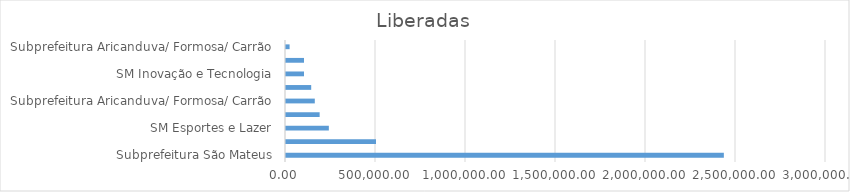
| Category | Series 0 |
|---|---|
| Subprefeitura São Mateus | 2432500 |
| Subprefeitura Penha | 500000 |
| SM Esportes e Lazer | 238000 |
| SM Turismo | 186940.63 |
| Subprefeitura Aricanduva/ Formosa/ Carrão | 160000 |
| Subprefeitura São Miguel Paulista | 140000 |
| SM Inovação e Tecnologia | 100000 |
| Subprefeitura Itaquera | 100000 |
| Subprefeitura Aricanduva/ Formosa/ Carrão | 20000 |